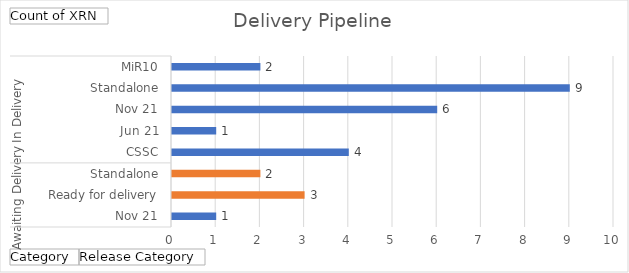
| Category | Total |
|---|---|
| 0 | 1 |
| 1 | 3 |
| 2 | 2 |
| 3 | 4 |
| 4 | 1 |
| 5 | 6 |
| 6 | 9 |
| 7 | 2 |